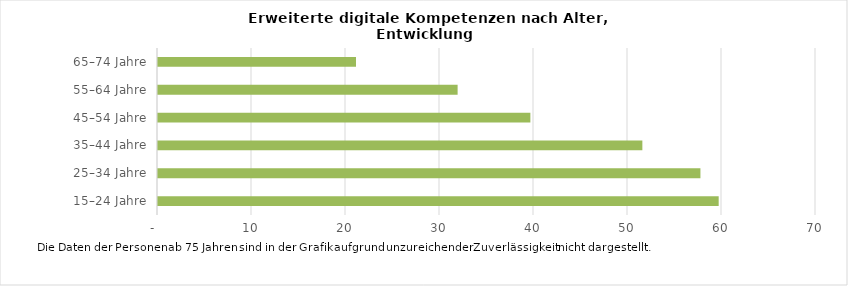
| Category | 2021 |
|---|---|
| 15–24 Jahre | 59.647 |
| 25–34 Jahre | 57.705 |
| 35–44 Jahre | 51.528 |
| 45–54 Jahre | 39.614 |
| 55–64 Jahre | 31.874 |
| 65–74 Jahre | 21.063 |